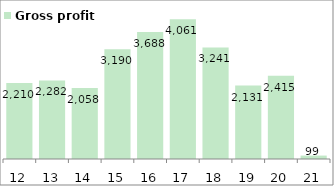
| Category | Gross profit  |
|---|---|
| 2012-03-31 | 2209.68 |
| 2013-03-31 | 2282.28 |
| 2014-03-31 | 2057.76 |
| 2015-03-31 | 3189.67 |
| 2016-03-31 | 3687.57 |
| 2017-03-31 | 4060.68 |
| 2018-03-31 | 3240.5 |
| 2019-03-31 | 2131.09 |
| 2020-03-31 | 2414.75 |
| 2021-03-31 | 99.1 |